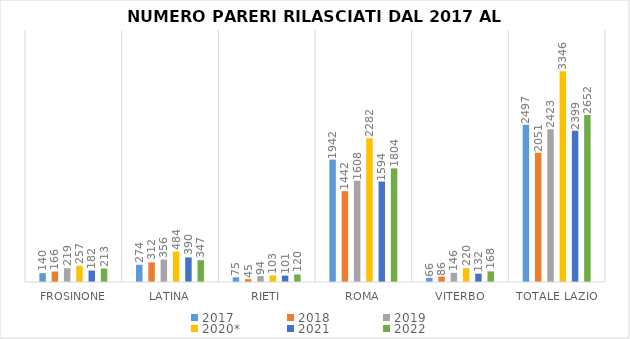
| Category | 2017 | 2018 | 2019 | 2020* | 2021 | 2022 |
|---|---|---|---|---|---|---|
| Frosinone | 140 | 166 | 219 | 257 | 182 | 213 |
| Latina | 274 | 312 | 356 | 484 | 390 | 347 |
| Rieti | 75 | 45 | 94 | 103 | 101 | 120 |
| Roma | 1942 | 1442 | 1608 | 2282 | 1594 | 1804 |
| Viterbo | 66 | 86 | 146 | 220 | 132 | 168 |
| Totale Lazio | 2497 | 2051 | 2423 | 3346 | 2399 | 2652 |